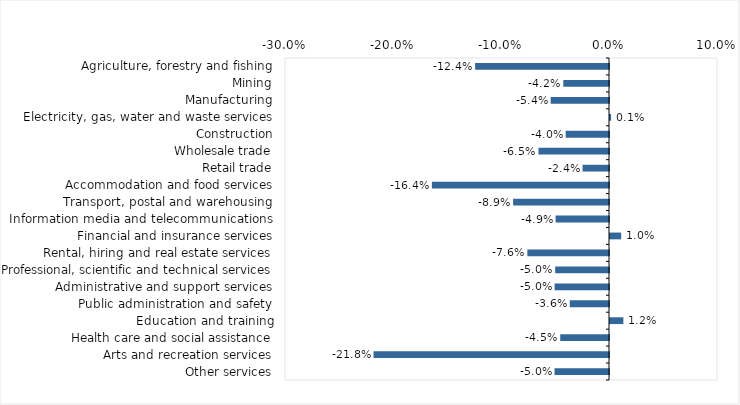
| Category | This week |
|---|---|
| Agriculture, forestry and fishing | -0.124 |
| Mining | -0.042 |
| Manufacturing | -0.054 |
| Electricity, gas, water and waste services | 0.001 |
| Construction | -0.04 |
| Wholesale trade | -0.065 |
| Retail trade | -0.024 |
| Accommodation and food services | -0.164 |
| Transport, postal and warehousing | -0.089 |
| Information media and telecommunications | -0.049 |
| Financial and insurance services | 0.01 |
| Rental, hiring and real estate services | -0.076 |
| Professional, scientific and technical services | -0.05 |
| Administrative and support services | -0.05 |
| Public administration and safety | -0.036 |
| Education and training | 0.012 |
| Health care and social assistance | -0.045 |
| Arts and recreation services | -0.218 |
| Other services | -0.05 |